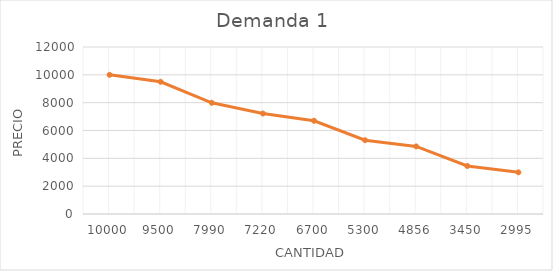
| Category | Demanda 1  |
|---|---|
| 10000.0 | 10000 |
| 9500.0 | 9500 |
| 7990.0 | 7990 |
| 7220.0 | 7220 |
| 6700.0 | 6700 |
| 5300.0 | 5300 |
| 4856.0 | 4856 |
| 3450.0 | 3450 |
| 2995.0 | 2995 |